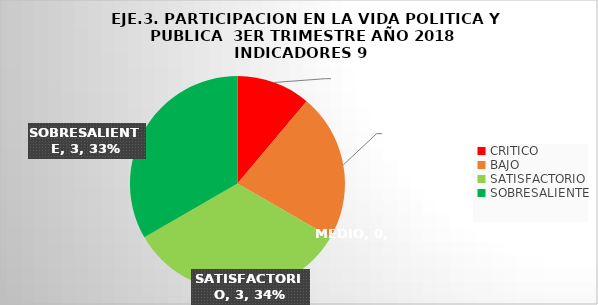
| Category | Series 0 |
|---|---|
| CRITICO | 1 |
| BAJO | 2 |
| MEDIO | 0 |
| SATISFACTORIO | 3 |
| SOBRESALIENTE | 3 |